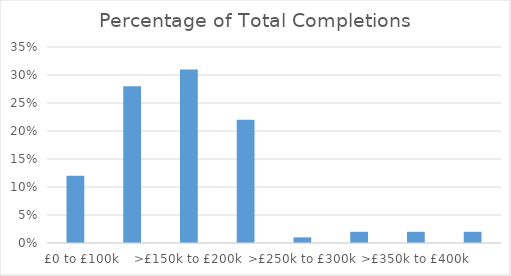
| Category | Series 0 |
|---|---|
|    £0 to £100k | 0.12 |
| >£100k to £150k | 0.28 |
| >£150k to £200k | 0.31 |
| >£200k to £250k | 0.22 |
| >£250k to £300k | 0.01 |
| >£300k to £350k | 0.02 |
| >£350k to £400k | 0.02 |
| >£400k to £450k | 0.02 |